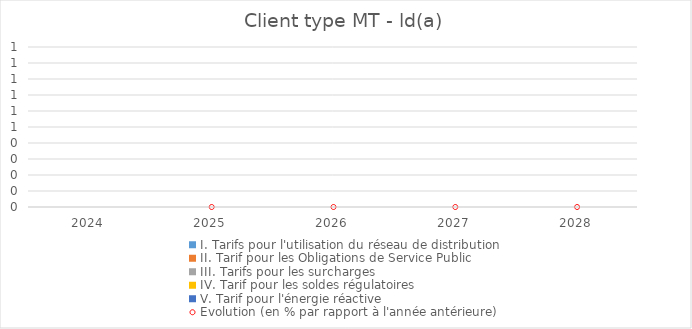
| Category | I. Tarifs pour l'utilisation du réseau de distribution | II. Tarif pour les Obligations de Service Public  | III. Tarifs pour les surcharges   | IV. Tarif pour les soldes régulatoires | V. Tarif pour l'énergie réactive |
|---|---|---|---|---|---|
| 2024.0 | 0 | 0 | 0 | 0 | 0 |
| 2025.0 | 0 | 0 | 0 | 0 | 0 |
| 2026.0 | 0 | 0 | 0 | 0 | 0 |
| 2027.0 | 0 | 0 | 0 | 0 | 0 |
| 2028.0 | 0 | 0 | 0 | 0 | 0 |